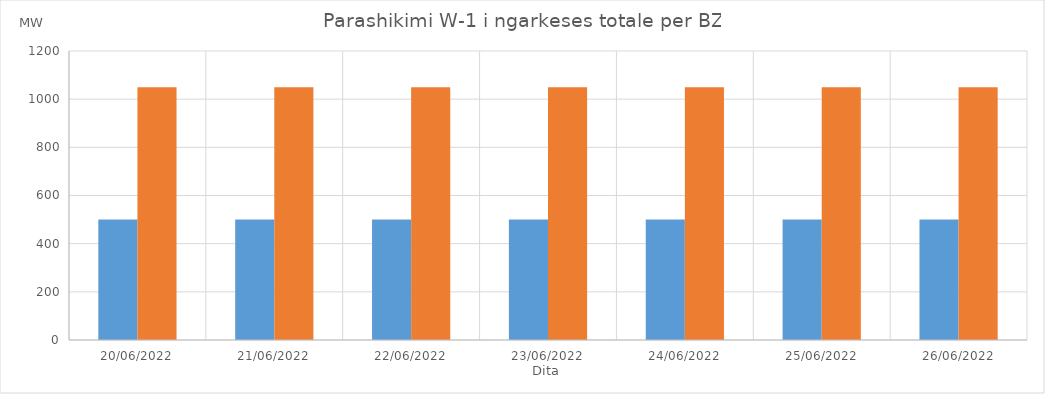
| Category | Min (MW) | Max (MW) |
|---|---|---|
| 20/06/2022 | 500 | 1050 |
| 21/06/2022 | 500 | 1050 |
| 22/06/2022 | 500 | 1050 |
| 23/06/2022 | 500 | 1050 |
| 24/06/2022 | 500 | 1050 |
| 25/06/2022 | 500 | 1050 |
| 26/06/2022 | 500 | 1050 |